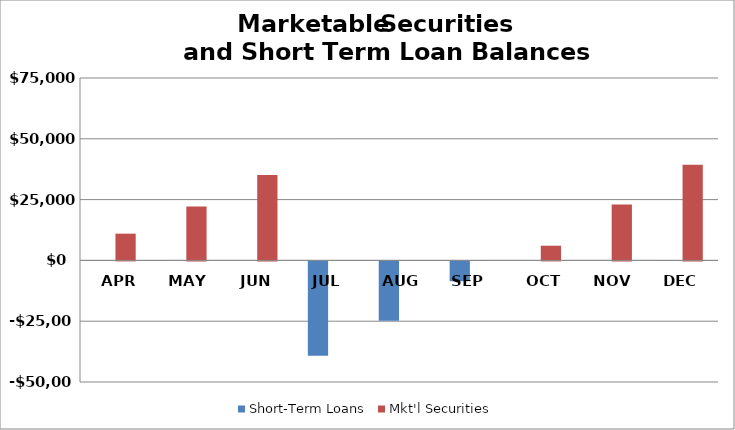
| Category | Short-Term Loans | Mkt'l Securities |
|---|---|---|
| APR | 0 | 11000 |
| MAY | 0 | 22157.5 |
| JUN | 0 | 35066.5 |
| JUL | -38752 | 0 |
| AUG | -24385 | 0 |
| SEP | -8145 | 0 |
| OCT | 0 | 6037.5 |
| NOV | 0 | 23017.5 |
| DEC | 0 | 39308.75 |